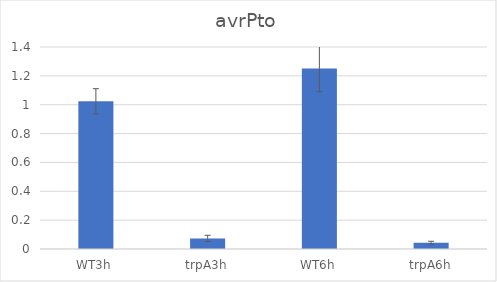
| Category | Series 0 |
|---|---|
| WT3h | 1.024 |
| trpA3h | 0.073 |
| WT6h | 1.252 |
| trpA6h | 0.043 |